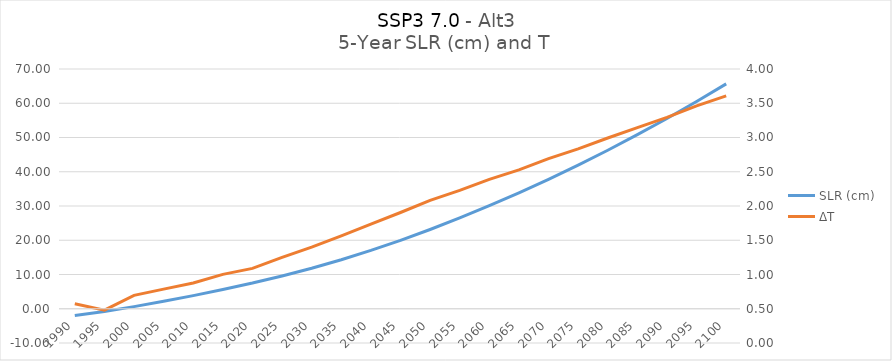
| Category | SLR (cm) |
|---|---|
| 1990.0 | -1.941 |
| 1995.0 | -0.818 |
| 2000.0 | 0.621 |
| 2005.0 | 2.18 |
| 2010.0 | 3.834 |
| 2015.0 | 5.633 |
| 2020.0 | 7.505 |
| 2025.0 | 9.582 |
| 2030.0 | 11.846 |
| 2035.0 | 14.32 |
| 2040.0 | 17.026 |
| 2045.0 | 19.961 |
| 2050.0 | 23.144 |
| 2055.0 | 26.508 |
| 2060.0 | 30.084 |
| 2065.0 | 33.829 |
| 2070.0 | 37.795 |
| 2075.0 | 41.936 |
| 2080.0 | 46.285 |
| 2085.0 | 50.827 |
| 2090.0 | 55.56 |
| 2095.0 | 60.522 |
| 2100.0 | 65.667 |